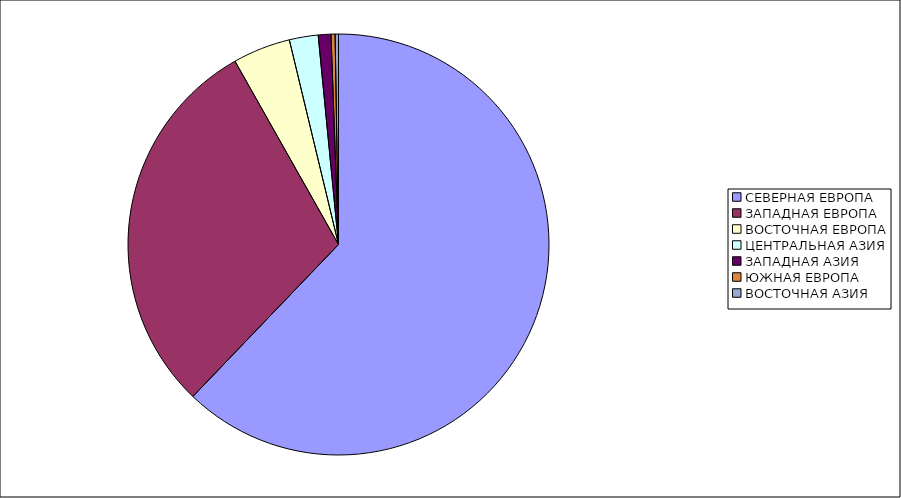
| Category | Оборот |
|---|---|
| СЕВЕРНАЯ ЕВРОПА | 62.159 |
| ЗАПАДНАЯ ЕВРОПА | 29.659 |
| ВОСТОЧНАЯ ЕВРОПА | 4.43 |
| ЦЕНТРАЛЬНАЯ АЗИЯ | 2.211 |
| ЗАПАДНАЯ АЗИЯ | 0.97 |
| ЮЖНАЯ ЕВРОПА | 0.314 |
| ВОСТОЧНАЯ АЗИЯ | 0.257 |